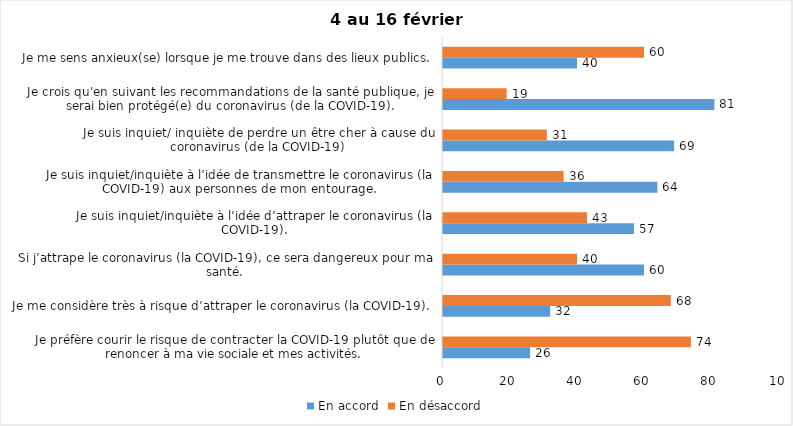
| Category | En accord | En désaccord |
|---|---|---|
| Je préfère courir le risque de contracter la COVID-19 plutôt que de renoncer à ma vie sociale et mes activités. | 26 | 74 |
| Je me considère très à risque d’attraper le coronavirus (la COVID-19). | 32 | 68 |
| Si j’attrape le coronavirus (la COVID-19), ce sera dangereux pour ma santé. | 60 | 40 |
| Je suis inquiet/inquiète à l’idée d’attraper le coronavirus (la COVID-19). | 57 | 43 |
| Je suis inquiet/inquiète à l’idée de transmettre le coronavirus (la COVID-19) aux personnes de mon entourage. | 64 | 36 |
| Je suis inquiet/ inquiète de perdre un être cher à cause du coronavirus (de la COVID-19) | 69 | 31 |
| Je crois qu'en suivant les recommandations de la santé publique, je serai bien protégé(e) du coronavirus (de la COVID-19). | 81 | 19 |
| Je me sens anxieux(se) lorsque je me trouve dans des lieux publics. | 40 | 60 |